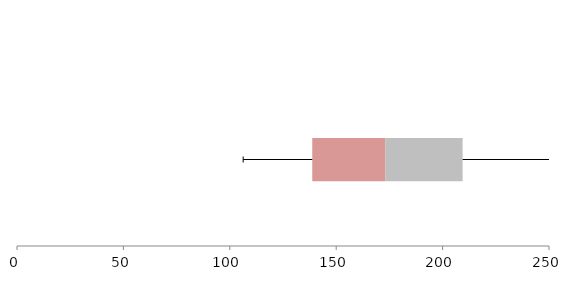
| Category | Series 1 | Series 2 | Series 3 |
|---|---|---|---|
| 0 | 138.75 | 34.405 | 36.245 |